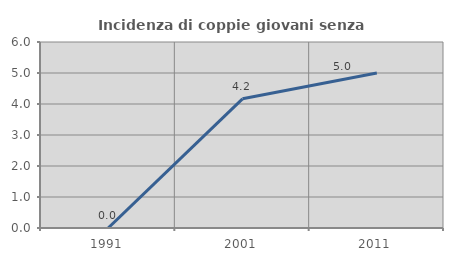
| Category | Incidenza di coppie giovani senza figli |
|---|---|
| 1991.0 | 0 |
| 2001.0 | 4.167 |
| 2011.0 | 5 |